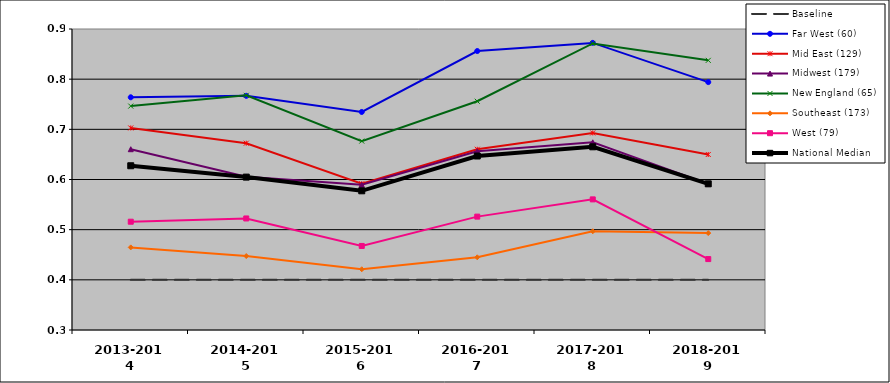
| Category | Baseline | Far West (60) | Mid East (129) | Midwest (179) | New England (65) | Southeast (173) | West (79) | National Median |
|---|---|---|---|---|---|---|---|---|
| 2013-2014 | 0.4 | 0.764 | 0.703 | 0.66 | 0.746 | 0.465 | 0.516 | 0.627 |
| 2014-2015 | 0.4 | 0.767 | 0.672 | 0.606 | 0.768 | 0.447 | 0.522 | 0.605 |
| 2015-2016 | 0.4 | 0.735 | 0.592 | 0.589 | 0.677 | 0.421 | 0.468 | 0.577 |
| 2016-2017 | 0.4 | 0.856 | 0.66 | 0.656 | 0.756 | 0.445 | 0.526 | 0.647 |
| 2017-2018 | 0.4 | 0.872 | 0.693 | 0.674 | 0.871 | 0.497 | 0.56 | 0.665 |
| 2018-2019 | 0.4 | 0.794 | 0.65 | 0.591 | 0.838 | 0.493 | 0.441 | 0.591 |